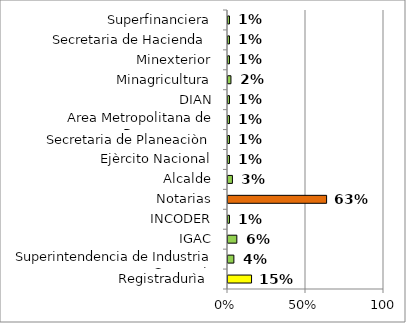
| Category | Series 0 |
|---|---|
| Registradurìa  | 0.151 |
| Superintendencia de Industria y Comercio | 0.038 |
| IGAC | 0.057 |
| INCODER | 0.009 |
| Notarias | 0.632 |
| Alcalde | 0.028 |
| Ejèrcito Nacional | 0.009 |
| Secretaria de Planeaciòn | 0.009 |
| Area Metropolitana de Bucaramanga | 0.009 |
| DIAN | 0.009 |
| Minagricultura | 0.019 |
| Minexterior | 0.009 |
| Secretaria de Hacienda  | 0.009 |
| Superfinanciera | 0.009 |